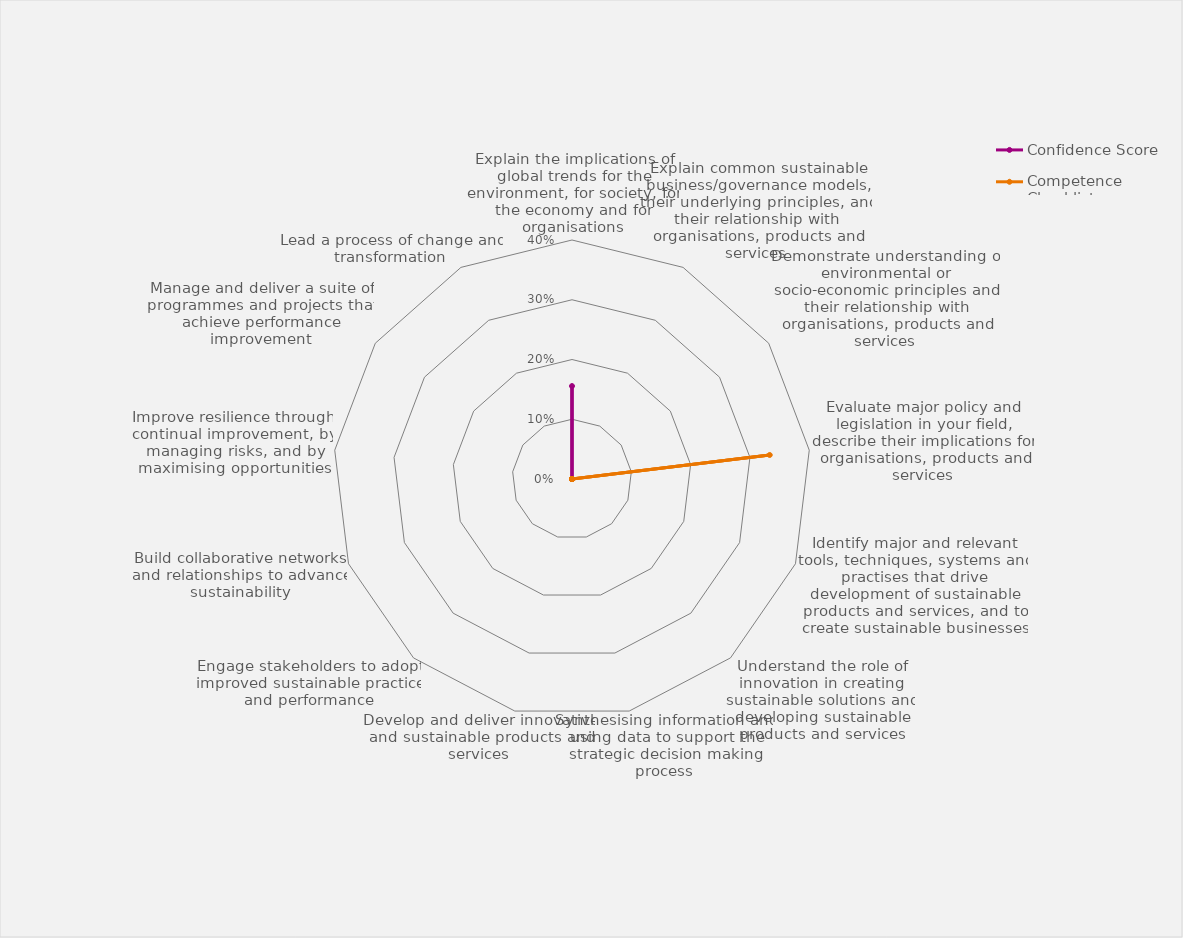
| Category | Confidence Score | Competence Checklist |
|---|---|---|
| Explain the implications of global trends for the environment, for society, for the economy and for organisations | 0.156 | 0 |
| Explain common sustainable business/governance models, their underlying principles, and their relationship with organisations, products and services | 0 | 0 |
| Demonstrate understanding of environmental or socio-economic principles and their relationship with organisations, products and services | 0 | 0 |
| Evaluate major policy and legislation in your field, describe their implications for organisations, products and services | 0 | 0.333 |
| Identify major and relevant tools, techniques, systems and practises that drive development of sustainable products and services, and to create sustainable businesses | 0 | 0 |
| Understand the role of innovation in creating sustainable solutions and developing sustainable products and services | 0 | 0 |
| Synthesising information and using data to support the strategic decision making process | 0 | 0 |
| Develop and deliver innovative and sustainable products and services | 0 | 0 |
| Engage stakeholders to adopt improved sustainable practice and performance | 0 | 0 |
| Build collaborative networks and relationships to advance sustainability | 0 | 0 |
| Improve resilience through continual improvement, by managing risks, and by maximising opportunities | 0 | 0 |
| Manage and deliver a suite of programmes and projects that achieve performance improvement | 0 | 0 |
| Lead a process of change and transformation  | 0 | 0 |